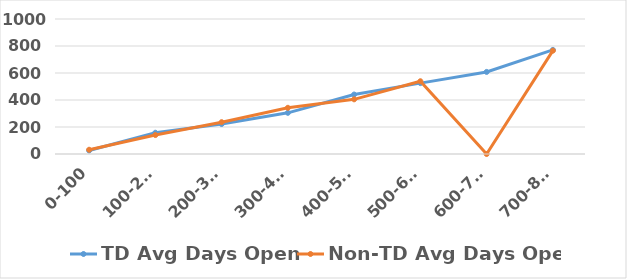
| Category | TD Avg Days Open  | Non-TD Avg Days Open |
|---|---|---|
| 0-100 | 25.6 | 31.47 |
| 100-200 | 157.5 | 140.346 |
| 200-300 | 222 | 235.75 |
| 300-400 | 305 | 342.222 |
| 400-500 | 440.5 | 405 |
| 500-600 | 525 | 539 |
| 600-700 | 608 | 0 |
| 700-800 | 771 | 765.333 |